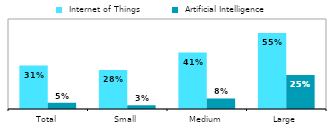
| Category |  Internet of Things |  Artificial Intelligence |
|---|---|---|
| Total | 0.314 | 0.045 |
| Small | 0.282 | 0.027 |
| Medium | 0.408 | 0.076 |
| Large | 0.549 | 0.245 |